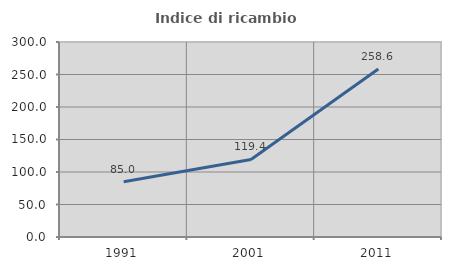
| Category | Indice di ricambio occupazionale  |
|---|---|
| 1991.0 | 84.992 |
| 2001.0 | 119.371 |
| 2011.0 | 258.601 |